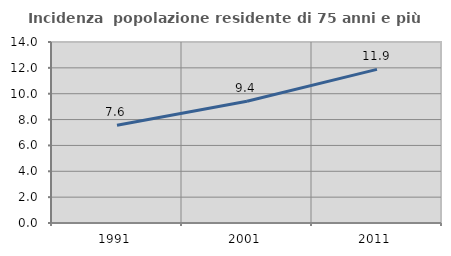
| Category | Incidenza  popolazione residente di 75 anni e più |
|---|---|
| 1991.0 | 7.565 |
| 2001.0 | 9.423 |
| 2011.0 | 11.885 |